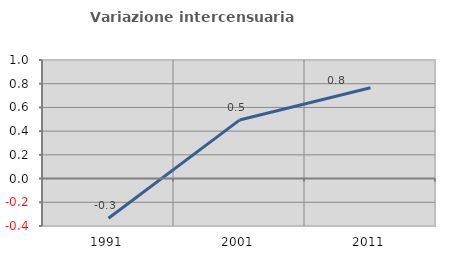
| Category | Variazione intercensuaria annua |
|---|---|
| 1991.0 | -0.334 |
| 2001.0 | 0.493 |
| 2011.0 | 0.765 |